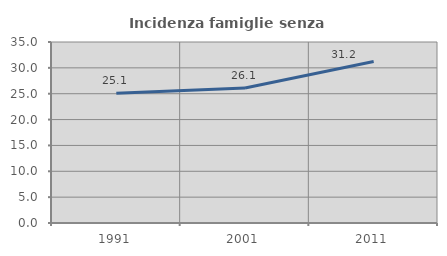
| Category | Incidenza famiglie senza nuclei |
|---|---|
| 1991.0 | 25.083 |
| 2001.0 | 26.107 |
| 2011.0 | 31.236 |